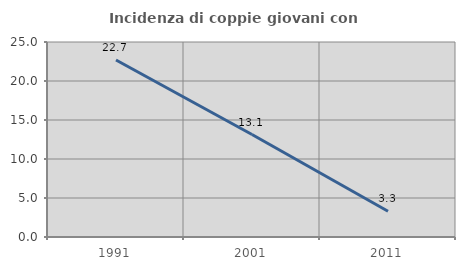
| Category | Incidenza di coppie giovani con figli |
|---|---|
| 1991.0 | 22.699 |
| 2001.0 | 13.139 |
| 2011.0 | 3.306 |